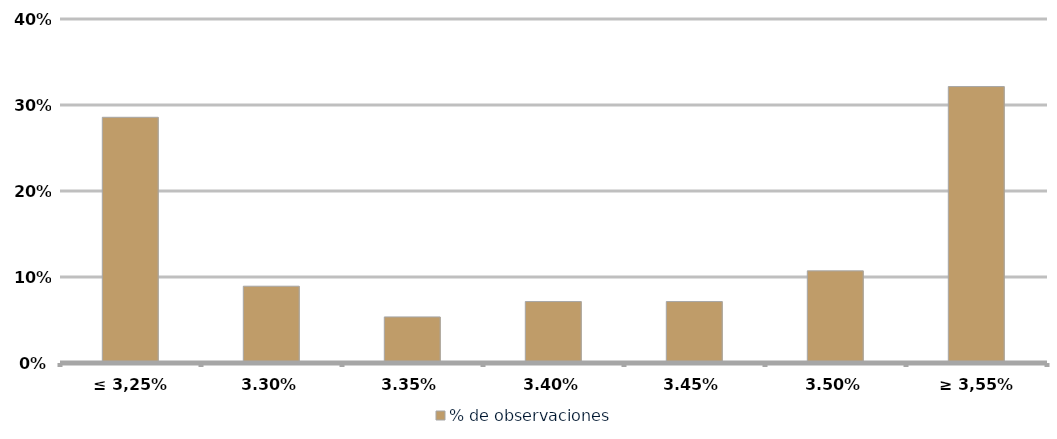
| Category | % de observaciones  |
|---|---|
| ≤ 3,25% | 0.286 |
| 3,30% | 0.089 |
| 3,35% | 0.054 |
| 3,40% | 0.071 |
| 3,45% | 0.071 |
| 3,50% | 0.107 |
| ≥ 3,55% | 0.321 |